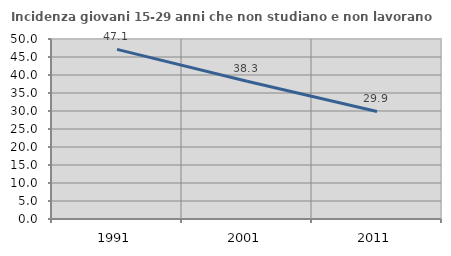
| Category | Incidenza giovani 15-29 anni che non studiano e non lavorano  |
|---|---|
| 1991.0 | 47.13 |
| 2001.0 | 38.256 |
| 2011.0 | 29.872 |